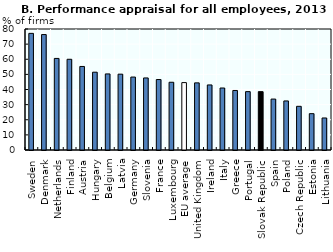
| Category | Series 0 |
|---|---|
| Sweden | 77.117 |
| Denmark | 76.325 |
| Netherlands | 60.542 |
| Finland | 59.985 |
| Austria | 55.236 |
| Hungary | 51.438 |
| Belgium | 50.299 |
| Latvia | 50.141 |
| Germany | 48.232 |
| Slovenia | 47.644 |
| France | 46.591 |
| Luxembourg | 44.784 |
| EU average | 44.561 |
| United Kingdom | 44.39 |
| Ireland | 43.011 |
| Italy | 40.991 |
| Greece | 39.349 |
| Portugal | 38.587 |
| Slovak Republic | 38.584 |
| Spain | 33.667 |
| Poland | 32.436 |
| Czech Republic | 28.876 |
| Estonia | 24.027 |
| Lithuania | 21.177 |